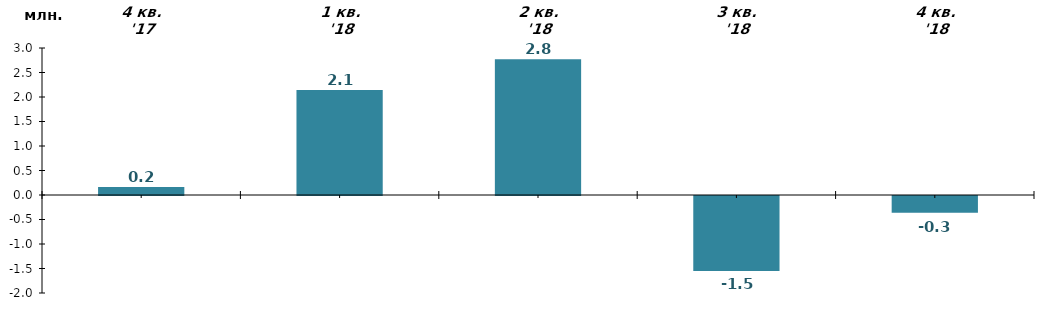
| Category | млн. грн. |
|---|---|
| 4 кв. '17 | 0.163 |
| 1 кв. '18 | 2.145 |
| 2 кв. '18 | 2.77 |
| 3 кв. '18 | -1.532 |
| 4 кв. '18 | -0.341 |